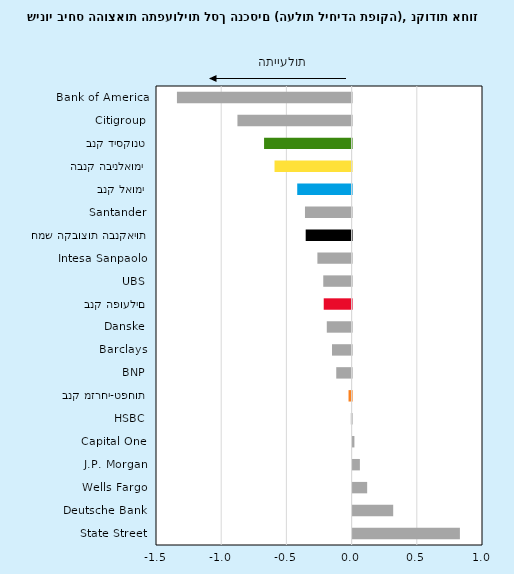
| Category | שינוי ביחס העלות ליחידת תפוקה |
|---|---|
| State Street | 0.823 |
| Deutsche Bank | 0.311 |
| Wells Fargo | 0.112 |
| J.P. Morgan | 0.056 |
| Capital One | 0.014 |
| HSBC | -0.006 |
| בנק מזרחי-טפחות | -0.024 |
| BNP | -0.118 |
| Barclays | -0.15 |
| Danske | -0.19 |
| בנק הפועלים | -0.214 |
| UBS | -0.217 |
| Intesa Sanpaolo | -0.262 |
| חמש הקבוצות הבנקאיות | -0.352 |
| Santander | -0.358 |
| בנק לאומי | -0.417 |
| הבנק הבינלאומי | -0.591 |
| בנק דיסקונט | -0.671 |
| Citigroup | -0.875 |
| Bank of America | -1.339 |